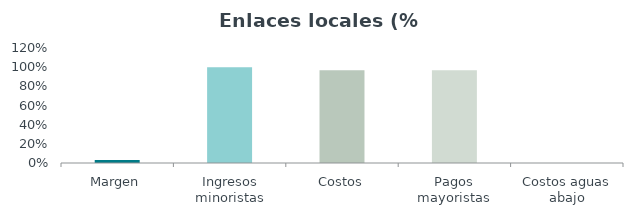
| Category | Series 0 |
|---|---|
| Margen | 0.031 |
| Ingresos minoristas | 1 |
| Costos | 0.969 |
| Pagos mayoristas | 0.968 |
| Costos aguas abajo | 0.001 |